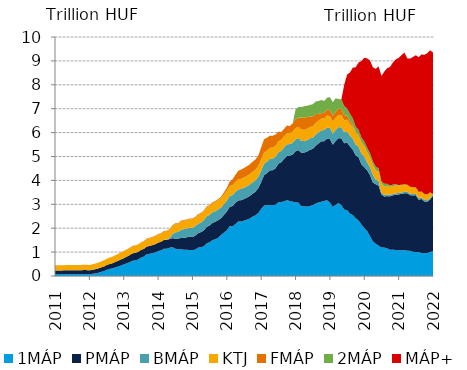
| Category | 1MÁP | PMÁP | BMÁP | KTJ | FMÁP | 2MÁP | MÁP+ |
|---|---|---|---|---|---|---|---|
| 1/31/11 | 0.085 | 0.141 | 0 | 0.218 | 0 | 0 | 0 |
| 2/28/11 | 0.085 | 0.147 | 0 | 0.218 | 0 | 0 | 0 |
| 3/31/11 | 0.081 | 0.149 | 0 | 0.217 | 0 | 0 | 0 |
| 4/30/11 | 0.082 | 0.156 | 0 | 0.216 | 0 | 0 | 0 |
| 5/31/11 | 0.083 | 0.158 | 0 | 0.215 | 0 | 0 | 0 |
| 6/30/11 | 0.083 | 0.159 | 0 | 0.214 | 0 | 0 | 0 |
| 7/31/11 | 0.082 | 0.16 | 0 | 0.214 | 0 | 0 | 0 |
| 8/31/11 | 0.081 | 0.161 | 0 | 0.215 | 0 | 0 | 0 |
| 9/30/11 | 0.08 | 0.164 | 0 | 0.217 | 0 | 0 | 0 |
| 10/31/11 | 0.079 | 0.166 | 0 | 0.219 | 0 | 0 | 0 |
| 11/30/11 | 0.08 | 0.166 | 0 | 0.223 | 0 | 0 | 0 |
| 12/31/11 | 0.08 | 0.166 | 0 | 0.226 | 0 | 0 | 0 |
| 1/31/12 | 0.081 | 0.155 | 0 | 0.225 | 0 | 0 | 0 |
| 2/29/12 | 0.089 | 0.168 | 0 | 0.23 | 0 | 0 | 0 |
| 3/31/12 | 0.106 | 0.176 | 0 | 0.236 | 0 | 0 | 0 |
| 4/30/12 | 0.131 | 0.182 | 0 | 0.24 | 0 | 0 | 0 |
| 5/31/12 | 0.17 | 0.186 | 0 | 0.245 | 0.003 | 0 | 0 |
| 6/30/12 | 0.198 | 0.194 | 0 | 0.25 | 0.004 | 0 | 0 |
| 7/31/12 | 0.254 | 0.2 | 0 | 0.257 | 0.006 | 0 | 0 |
| 8/31/12 | 0.294 | 0.206 | 0 | 0.263 | 0.008 | 0 | 0 |
| 9/30/12 | 0.32 | 0.211 | 0 | 0.268 | 0.008 | 0 | 0 |
| 10/31/12 | 0.358 | 0.227 | 0 | 0.273 | 0.01 | 0 | 0 |
| 11/30/12 | 0.395 | 0.242 | 0 | 0.279 | 0.009 | 0 | 0 |
| 12/31/12 | 0.434 | 0.256 | 0 | 0.284 | 0.01 | 0 | 0 |
| 1/31/13 | 0.482 | 0.26 | 0 | 0.289 | 0.011 | 0 | 0 |
| 2/28/13 | 0.528 | 0.279 | 0 | 0.291 | 0.012 | 0 | 0 |
| 3/31/13 | 0.57 | 0.3 | 0 | 0.294 | 0.013 | 0 | 0 |
| 4/30/13 | 0.636 | 0.31 | 0 | 0.297 | 0.014 | 0 | 0 |
| 5/31/13 | 0.655 | 0.314 | 0 | 0.3 | 0.014 | 0 | 0 |
| 6/30/13 | 0.687 | 0.317 | 0 | 0.302 | 0.014 | 0 | 0 |
| 7/31/13 | 0.766 | 0.324 | 0 | 0.306 | 0.015 | 0 | 0 |
| 8/31/13 | 0.813 | 0.317 | 0 | 0.313 | 0.016 | 0 | 0 |
| 9/30/13 | 0.907 | 0.324 | 0 | 0.317 | 0.019 | 0 | 0 |
| 10/31/13 | 0.927 | 0.33 | 0 | 0.321 | 0.019 | 0 | 0 |
| 11/30/13 | 0.955 | 0.336 | 0 | 0.328 | 0.021 | 0 | 0 |
| 12/31/13 | 0.988 | 0.343 | 0 | 0.335 | 0.021 | 0 | 0 |
| 1/31/14 | 1.039 | 0.354 | 0 | 0.337 | 0.022 | 0 | 0 |
| 2/28/14 | 1.073 | 0.359 | 0 | 0.34 | 0.023 | 0 | 0 |
| 3/31/14 | 1.143 | 0.363 | 0.008 | 0.345 | 0.025 | 0 | 0 |
| 4/30/14 | 1.14 | 0.364 | 0.02 | 0.346 | 0.026 | 0 | 0 |
| 5/31/14 | 1.182 | 0.367 | 0.041 | 0.347 | 0.027 | 0 | 0 |
| 6/30/14 | 1.206 | 0.379 | 0.165 | 0.347 | 0.028 | 0 | 0 |
| 7/31/14 | 1.142 | 0.419 | 0.27 | 0.347 | 0.027 | 0 | 0 |
| 8/31/14 | 1.119 | 0.446 | 0.275 | 0.348 | 0.027 | 0 | 0 |
| 9/30/14 | 1.116 | 0.475 | 0.347 | 0.349 | 0.029 | 0 | 0 |
| 10/31/14 | 1.101 | 0.499 | 0.365 | 0.352 | 0.029 | 0 | 0 |
| 11/30/14 | 1.096 | 0.524 | 0.368 | 0.353 | 0.029 | 0 | 0 |
| 12/31/14 | 1.089 | 0.556 | 0.372 | 0.355 | 0.029 | 0 | 0 |
| 1/31/15 | 1.084 | 0.545 | 0.387 | 0.358 | 0.033 | 0 | 0 |
| 2/28/15 | 1.105 | 0.589 | 0.391 | 0.359 | 0.034 | 0 | 0 |
| 3/31/15 | 1.189 | 0.603 | 0.394 | 0.368 | 0.035 | 0 | 0 |
| 4/30/15 | 1.204 | 0.635 | 0.397 | 0.37 | 0.034 | 0 | 0 |
| 5/31/15 | 1.246 | 0.665 | 0.435 | 0.372 | 0.034 | 0 | 0 |
| 6/30/15 | 1.371 | 0.686 | 0.444 | 0.376 | 0.035 | 0 | 0 |
| 7/31/15 | 1.41 | 0.706 | 0.446 | 0.382 | 0.033 | 0 | 0 |
| 8/31/15 | 1.503 | 0.718 | 0.447 | 0.387 | 0.036 | 0 | 0 |
| 9/30/15 | 1.537 | 0.728 | 0.448 | 0.389 | 0.035 | 0 | 0 |
| 10/31/15 | 1.601 | 0.739 | 0.449 | 0.394 | 0.037 | 0 | 0 |
| 11/30/15 | 1.719 | 0.701 | 0.451 | 0.398 | 0.052 | 0 | 0 |
| 12/31/15 | 1.816 | 0.744 | 0.454 | 0.403 | 0.081 | 0 | 0 |
| 1/31/16 | 1.914 | 0.782 | 0.455 | 0.409 | 0.127 | 0 | 0 |
| 2/29/16 | 2.088 | 0.809 | 0.456 | 0.415 | 0.18 | 0 | 0 |
| 3/31/16 | 2.076 | 0.852 | 0.46 | 0.415 | 0.243 | 0 | 0 |
| 4/30/16 | 2.17 | 0.885 | 0.461 | 0.419 | 0.293 | 0 | 0 |
| 5/31/16 | 2.287 | 0.874 | 0.465 | 0.423 | 0.353 | 0 | 0 |
| 6/30/16 | 2.281 | 0.892 | 0.467 | 0.426 | 0.388 | 0 | 0 |
| 7/31/16 | 2.315 | 0.907 | 0.47 | 0.43 | 0.395 | 0 | 0 |
| 8/31/16 | 2.355 | 0.924 | 0.472 | 0.433 | 0.407 | 0 | 0 |
| 9/30/16 | 2.407 | 0.941 | 0.475 | 0.437 | 0.406 | 0 | 0 |
| 10/31/16 | 2.484 | 0.959 | 0.476 | 0.439 | 0.424 | 0 | 0 |
| 11/30/16 | 2.541 | 0.985 | 0.477 | 0.444 | 0.429 | 0 | 0 |
| 12/31/16 | 2.637 | 1.043 | 0.478 | 0.454 | 0.429 | 0 | 0 |
| 1/31/17 | 2.806 | 1.125 | 0.479 | 0.46 | 0.516 | 0 | 0 |
| 2/28/17 | 2.947 | 1.268 | 0.48 | 0.46 | 0.568 | 0 | 0 |
| 3/31/17 | 2.967 | 1.337 | 0.481 | 0.46 | 0.535 | 0 | 0 |
| 4/30/17 | 2.961 | 1.462 | 0.481 | 0.459 | 0.508 | 0 | 0 |
| 5/31/17 | 2.974 | 1.454 | 0.481 | 0.456 | 0.503 | 0 | 0 |
| 6/30/17 | 2.977 | 1.528 | 0.481 | 0.456 | 0.475 | 0 | 0 |
| 7/31/17 | 3.088 | 1.608 | 0.48 | 0.457 | 0.409 | 0 | 0 |
| 8/31/17 | 3.097 | 1.661 | 0.48 | 0.457 | 0.327 | 0 | 0 |
| 9/30/17 | 3.123 | 1.782 | 0.48 | 0.459 | 0.319 | 0 | 0 |
| 10/31/17 | 3.171 | 1.858 | 0.48 | 0.462 | 0.325 | 0 | 0 |
| 11/30/17 | 3.136 | 1.904 | 0.481 | 0.463 | 0.291 | 0 | 0 |
| 12/31/17 | 3.11 | 1.976 | 0.481 | 0.469 | 0.352 | 0 | 0 |
| 1/31/18 | 3.078 | 2.141 | 0.502 | 0.471 | 0.365 | 0.412 | 0 |
| 2/28/18 | 3.071 | 2.197 | 0.501 | 0.471 | 0.393 | 0.436 | 0 |
| 3/31/18 | 2.925 | 2.233 | 0.501 | 0.472 | 0.488 | 0.446 | 0 |
| 4/30/18 | 2.913 | 2.251 | 0.478 | 0.473 | 0.528 | 0.46 | 0 |
| 5/31/18 | 2.904 | 2.303 | 0.479 | 0.472 | 0.488 | 0.475 | 0 |
| 6/30/18 | 2.927 | 2.355 | 0.479 | 0.474 | 0.439 | 0.485 | 0 |
| 7/31/18 | 2.964 | 2.354 | 0.465 | 0.476 | 0.424 | 0.503 | 0 |
| 8/31/18 | 3.03 | 2.416 | 0.465 | 0.482 | 0.378 | 0.526 | 0 |
| 9/30/18 | 3.078 | 2.468 | 0.465 | 0.485 | 0.286 | 0.538 | 0 |
| 10/31/18 | 3.109 | 2.525 | 0.465 | 0.488 | 0.228 | 0.554 | 0 |
| 11/30/18 | 3.141 | 2.5 | 0.465 | 0.493 | 0.237 | 0.484 | 0 |
| 12/31/18 | 3.17 | 2.576 | 0.465 | 0.496 | 0.254 | 0.5 | 0 |
| 1/31/19 | 3.075 | 2.654 | 0.465 | 0.5 | 0.257 | 0.536 | 0 |
| 2/28/19 | 2.887 | 2.61 | 0.464 | 0.502 | 0.25 | 0.557 | 0 |
| 3/31/19 | 2.979 | 2.668 | 0.464 | 0.504 | 0.255 | 0.565 | 0 |
| 4/30/19 | 3.051 | 2.718 | 0.464 | 0.506 | 0.276 | 0.392 | 0 |
| 5/31/19 | 2.966 | 2.79 | 0.464 | 0.507 | 0.263 | 0.398 | 0 |
| 6/30/19 | 2.774 | 2.778 | 0.461 | 0.498 | 0.213 | 0.394 | 0.883 |
| 7/31/19 | 2.759 | 2.831 | 0.46 | 0.49 | 0.167 | 0.303 | 1.417 |
| 8/31/19 | 2.61 | 2.81 | 0.459 | 0.486 | 0.131 | 0.293 | 1.725 |
| 9/30/19 | 2.551 | 2.733 | 0.458 | 0.489 | 0.088 | 0.279 | 2.124 |
| 10/31/19 | 2.418 | 2.631 | 0.453 | 0.487 | 0.03 | 0.228 | 2.485 |
| 11/30/19 | 2.322 | 2.648 | 0.452 | 0.473 | 0 | 0.225 | 2.815 |
| 12/31/19 | 2.158 | 2.518 | 0.451 | 0.455 | 0 | 0.215 | 3.196 |
| 1/31/20 | 2.009 | 2.542 | 0.451 | 0.439 | 0 | 0.183 | 3.504 |
| 2/29/20 | 1.884 | 2.541 | 0.331 | 0.426 | 0 | 0.182 | 3.744 |
| 3/31/20 | 1.673 | 2.552 | 0.331 | 0.409 | 0 | 0.18 | 3.872 |
| 4/30/20 | 1.448 | 2.466 | 0.33 | 0.399 | 0 | 0.151 | 3.939 |
| 5/31/20 | 1.35 | 2.491 | 0.189 | 0.393 | 0 | 0.151 | 4.09 |
| 6/30/20 | 1.268 | 2.513 | 0.189 | 0.383 | 0 | 0.15 | 4.268 |
| 7/31/20 | 1.189 | 2.221 | 0.07 | 0.374 | 0 | 0.108 | 4.409 |
| 8/31/20 | 1.189 | 2.138 | 0.07 | 0.361 | 0 | 0.107 | 4.689 |
| 9/30/20 | 1.158 | 2.185 | 0.062 | 0.347 | 0 | 0.107 | 4.839 |
| 10/31/20 | 1.1 | 2.231 | 0.062 | 0.336 | 0 | 0.06 | 4.958 |
| 11/30/20 | 1.103 | 2.272 | 0.062 | 0.328 | 0 | 0.06 | 5.11 |
| 12/31/20 | 1.088 | 2.31 | 0.061 | 0.321 | 0 | 0.059 | 5.221 |
| 1/31/21 | 1.081 | 2.332 | 0.061 | 0.315 | 0 | 0.013 | 5.322 |
| 2/28/21 | 1.078 | 2.356 | 0.061 | 0.31 | 0 | 0.013 | 5.419 |
| 3/31/21 | 1.078 | 2.381 | 0.061 | 0.303 | 0 | 0.013 | 5.519 |
| 4/30/21 | 1.06 | 2.403 | 0.061 | 0.298 | 0 | 0 | 5.285 |
| 5/31/21 | 1.052 | 2.33 | 0.061 | 0.293 | 0 | 0 | 5.361 |
| 6/30/21 | 1.013 | 2.358 | 0.061 | 0.283 | 0 | 0 | 5.449 |
| 7/31/21 | 0.999 | 2.381 | 0.061 | 0.274 | 0 | 0 | 5.523 |
| 8/31/21 | 1.003 | 2.189 | 0.061 | 0.265 | 0 | 0 | 5.632 |
| 9/30/21 | 0.962 | 2.258 | 0.061 | 0.254 | 0 | 0 | 5.734 |
| 10/31/21 | 0.957 | 2.164 | 0.061 | 0.245 | 0 | 0 | 5.827 |
| 11/30/21 | 0.966 | 2.145 | 0.061 | 0.239 | 0 | 0 | 5.911 |
| 12/31/21 | 1.002 | 2.203 | 0.061 | 0.235 | 0 | 0 | 5.946 |
| 1/31/22 | 1.048 | 2.314 | 0.061 | 0 | 0 | 0 | 5.925 |